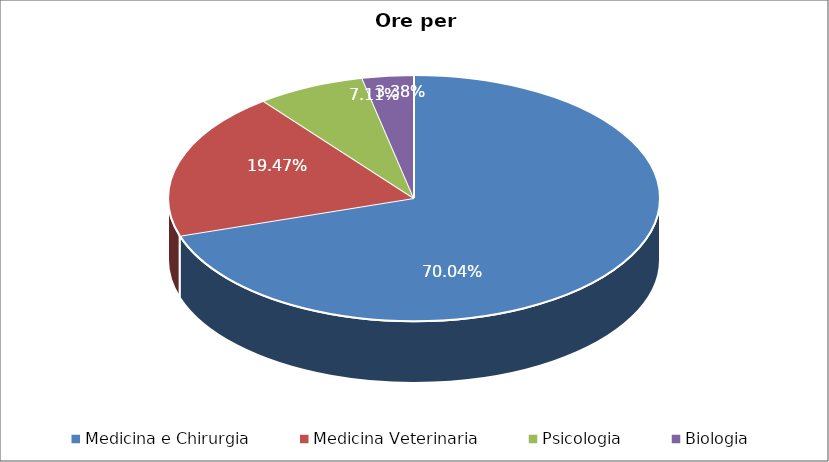
| Category | Series 0 |
|---|---|
| Medicina e Chirurgia | 3477 |
| Medicina Veterinaria | 966.5 |
| Psicologia | 353 |
| Biologia | 168 |